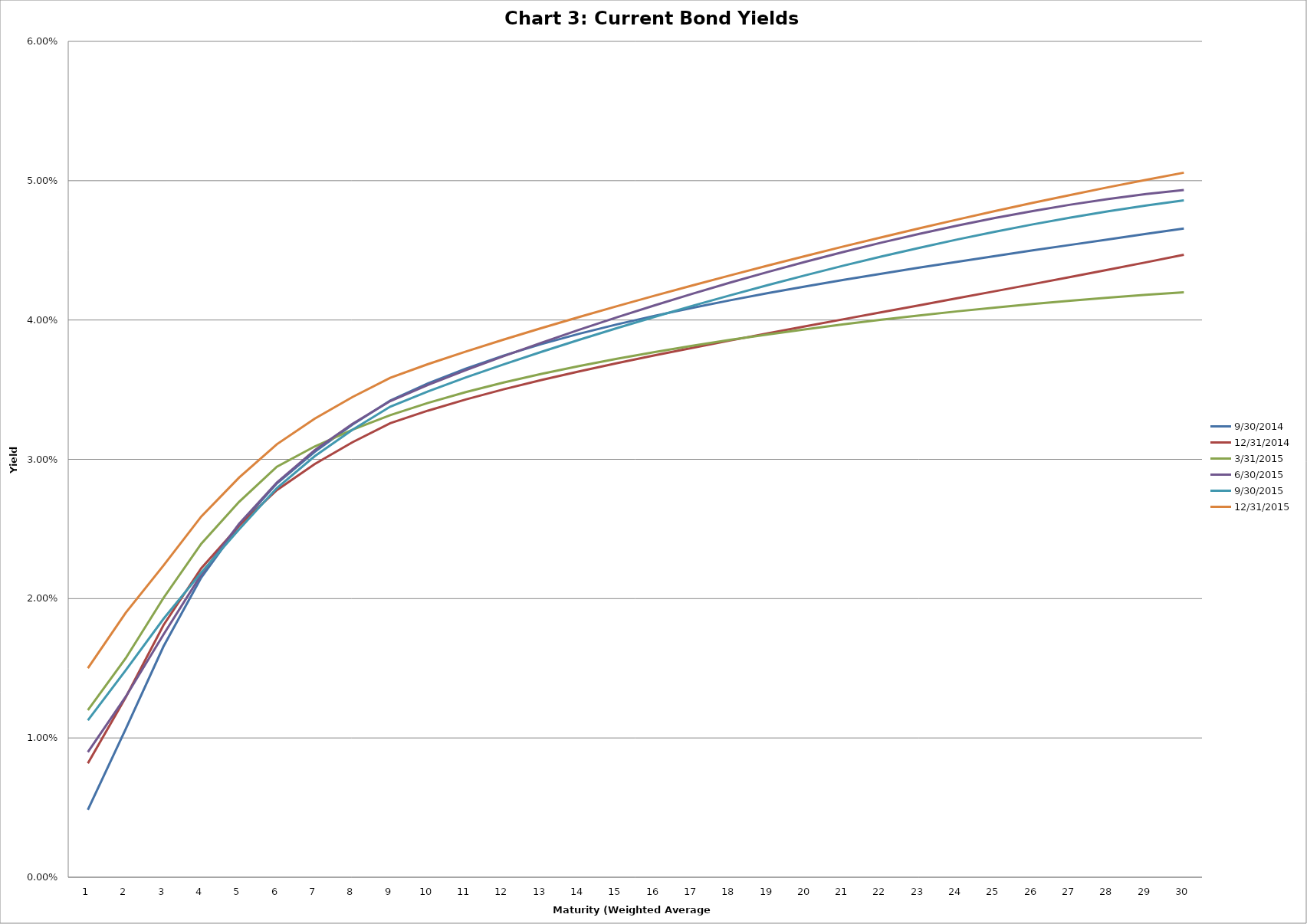
| Category | 9/30/2014 | 12/31/2014 | 3/31/2015 | 6/30/2015 | 9/30/2015 | 12/31/2015 |
|---|---|---|---|---|---|---|
| 0 | 0.005 | 0.008 | 0.012 | 0.009 | 0.011 | 0.015 |
| 1 | 0.011 | 0.013 | 0.016 | 0.013 | 0.015 | 0.019 |
| 2 | 0.017 | 0.018 | 0.02 | 0.017 | 0.019 | 0.022 |
| 3 | 0.022 | 0.022 | 0.024 | 0.022 | 0.022 | 0.026 |
| 4 | 0.025 | 0.025 | 0.027 | 0.025 | 0.025 | 0.029 |
| 5 | 0.028 | 0.028 | 0.029 | 0.028 | 0.028 | 0.031 |
| 6 | 0.031 | 0.03 | 0.031 | 0.031 | 0.03 | 0.033 |
| 7 | 0.032 | 0.031 | 0.032 | 0.033 | 0.032 | 0.034 |
| 8 | 0.034 | 0.033 | 0.033 | 0.034 | 0.034 | 0.036 |
| 9 | 0.035 | 0.033 | 0.034 | 0.035 | 0.035 | 0.037 |
| 10 | 0.037 | 0.034 | 0.035 | 0.036 | 0.036 | 0.038 |
| 11 | 0.037 | 0.035 | 0.036 | 0.037 | 0.037 | 0.039 |
| 12 | 0.038 | 0.036 | 0.036 | 0.038 | 0.038 | 0.039 |
| 13 | 0.039 | 0.036 | 0.037 | 0.039 | 0.039 | 0.04 |
| 14 | 0.04 | 0.037 | 0.037 | 0.04 | 0.039 | 0.041 |
| 15 | 0.04 | 0.037 | 0.038 | 0.041 | 0.04 | 0.042 |
| 16 | 0.041 | 0.038 | 0.038 | 0.042 | 0.041 | 0.042 |
| 17 | 0.041 | 0.039 | 0.039 | 0.043 | 0.042 | 0.043 |
| 18 | 0.042 | 0.039 | 0.039 | 0.043 | 0.043 | 0.044 |
| 19 | 0.042 | 0.04 | 0.039 | 0.044 | 0.043 | 0.045 |
| 20 | 0.043 | 0.04 | 0.04 | 0.045 | 0.044 | 0.045 |
| 21 | 0.043 | 0.041 | 0.04 | 0.046 | 0.045 | 0.046 |
| 22 | 0.044 | 0.041 | 0.04 | 0.046 | 0.045 | 0.047 |
| 23 | 0.044 | 0.042 | 0.041 | 0.047 | 0.046 | 0.047 |
| 24 | 0.045 | 0.042 | 0.041 | 0.047 | 0.046 | 0.048 |
| 25 | 0.045 | 0.043 | 0.041 | 0.048 | 0.047 | 0.048 |
| 26 | 0.045 | 0.043 | 0.041 | 0.048 | 0.047 | 0.049 |
| 27 | 0.046 | 0.044 | 0.042 | 0.049 | 0.048 | 0.05 |
| 28 | 0.046 | 0.044 | 0.042 | 0.049 | 0.048 | 0.05 |
| 29 | 0.047 | 0.045 | 0.042 | 0.049 | 0.049 | 0.051 |